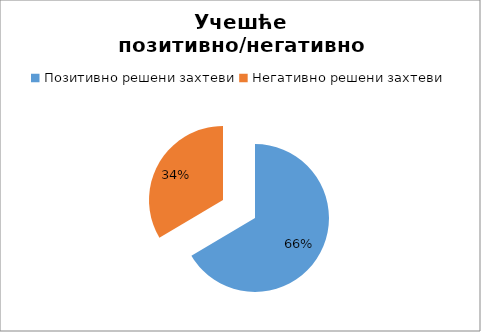
| Category | Series 0 |
|---|---|
| Позитивно решени захтеви | 0.665 |
| Негативно решени захтеви | 0.335 |